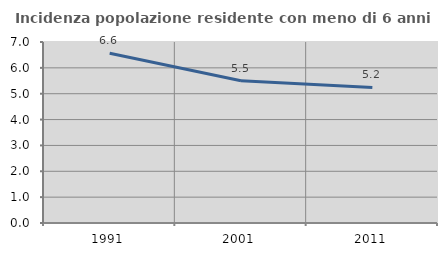
| Category | Incidenza popolazione residente con meno di 6 anni |
|---|---|
| 1991.0 | 6.564 |
| 2001.0 | 5.502 |
| 2011.0 | 5.245 |